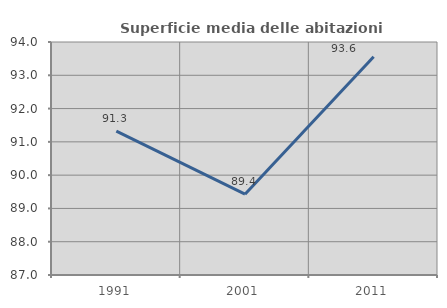
| Category | Superficie media delle abitazioni occupate |
|---|---|
| 1991.0 | 91.321 |
| 2001.0 | 89.428 |
| 2011.0 | 93.559 |